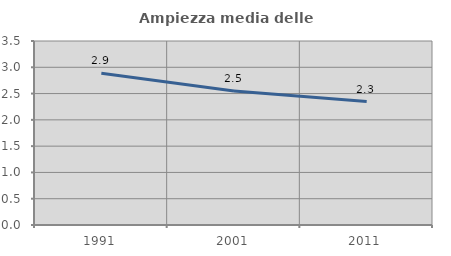
| Category | Ampiezza media delle famiglie |
|---|---|
| 1991.0 | 2.888 |
| 2001.0 | 2.55 |
| 2011.0 | 2.347 |